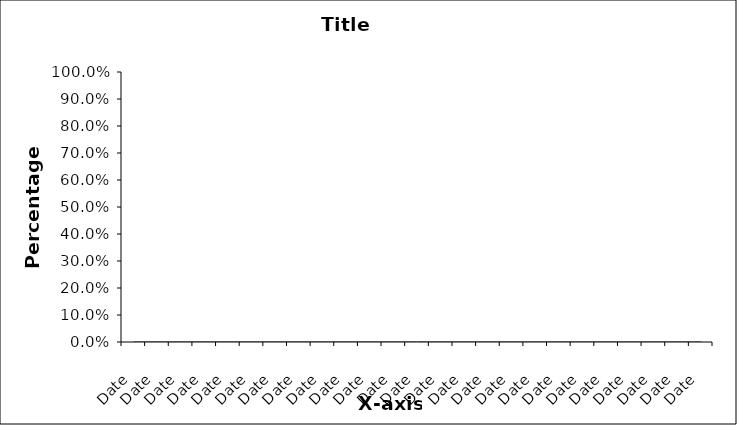
| Category | Series 1 |
|---|---|
| Date | 0 |
| Date | 0 |
| Date | 0 |
| Date | 0 |
| Date | 0 |
| Date | 0 |
| Date | 0 |
| Date | 0 |
| Date | 0 |
| Date | 0 |
| Date | 0 |
| Date | 0 |
| Date | 0 |
| Date | 0 |
| Date | 0 |
| Date | 0 |
| Date | 0 |
| Date | 0 |
| Date | 0 |
| Date | 0 |
| Date | 0 |
| Date | 0 |
| Date | 0 |
| Date | 0 |
| Date | 0 |